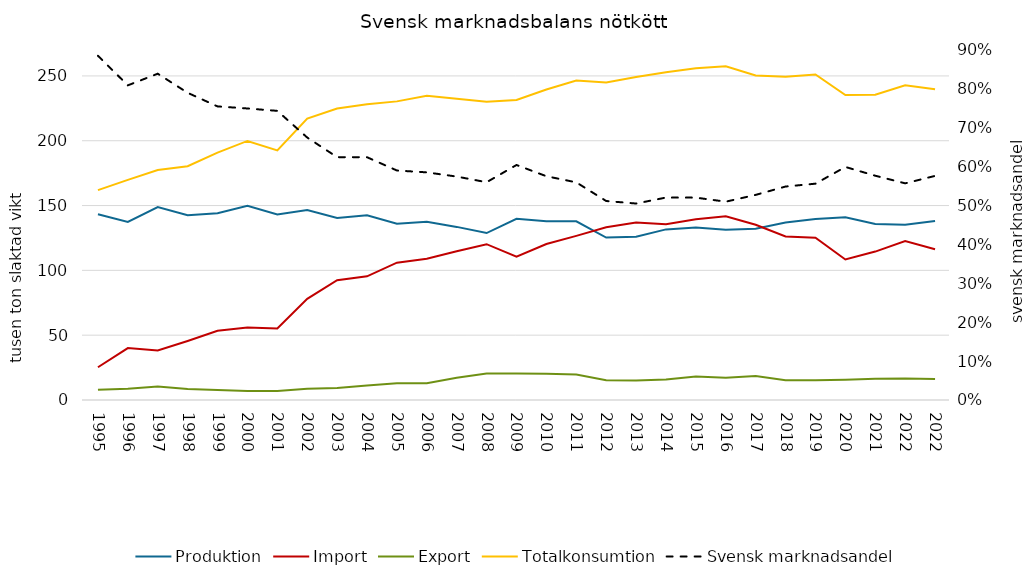
| Category | Produktion | Import | Export | Totalkonsumtion |
|---|---|---|---|---|
| 1995.0 | 143.329 | 25.257 | 7.825 | 161.935 |
| 1996.0 | 137.416 | 40.038 | 8.745 | 169.834 |
| 1997.0 | 148.885 | 38.162 | 10.393 | 177.445 |
| 1998.0 | 142.498 | 45.56 | 8.441 | 180.389 |
| 1999.0 | 144.038 | 53.405 | 7.768 | 190.79 |
| 2000.0 | 149.808 | 55.927 | 7.003 | 199.844 |
| 2001.0 | 143.191 | 55.154 | 6.93 | 192.588 |
| 2002.0 | 146.479 | 78.035 | 8.71 | 217.033 |
| 2003.0 | 140.403 | 92.457 | 9.327 | 224.844 |
| 2004.0 | 142.423 | 95.416 | 11.095 | 228.133 |
| 2005.0 | 135.943 | 105.968 | 12.938 | 230.37 |
| 2006.0 | 137.41 | 108.9 | 12.939 | 234.748 |
| 2007.0 | 133.54 | 114.722 | 17.232 | 232.434 |
| 2008.0 | 128.793 | 120.204 | 20.469 | 229.991 |
| 2009.0 | 139.834 | 110.478 | 20.454 | 231.397 |
| 2010.0 | 137.8 | 120.367 | 20.222 | 239.484 |
| 2011.0 | 137.88 | 126.597 | 19.651 | 246.375 |
| 2012.0 | 125.32 | 133.273 | 15.182 | 244.907 |
| 2013.0 | 125.88 | 136.9 | 15.065 | 249.167 |
| 2014.0 | 131.62 | 135.592 | 15.884 | 252.821 |
| 2015.0 | 133.14 | 139.395 | 18.161 | 255.866 |
| 2016.0 | 131.25 | 141.758 | 17.208 | 257.369 |
| 2017.0 | 132.07 | 135.205 | 18.446 | 250.402 |
| 2018.0 | 136.87 | 126.182 | 15.26 | 249.344 |
| 2019.0 | 139.67 | 125.196 | 15.257 | 251.085 |
| 2020.0 | 141 | 108.402 | 15.642 | 235.276 |
| 2021.0 | 135.82 | 114.502 | 16.354 | 235.52 |
| 2022.0 | 135.24 | 122.662 | 16.673 | 242.744 |
| 2022.0 | 138.17 | 116.254 | 16.139 | 239.756 |